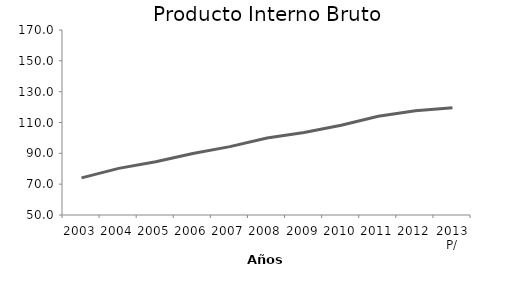
| Category | Producto Interno Bruto a precios de mercado  |
|---|---|
| 2003 | 74.097 |
| 2004 | 80.255 |
| 2005 | 84.596 |
| 2006 | 89.926 |
| 2007 | 94.339 |
| 2008 | 100 |
| 2009 | 103.537 |
| 2010 | 108.181 |
| 2011 | 114.033 |
| 2012 | 117.639 |
| 2013 P/ | 119.608 |